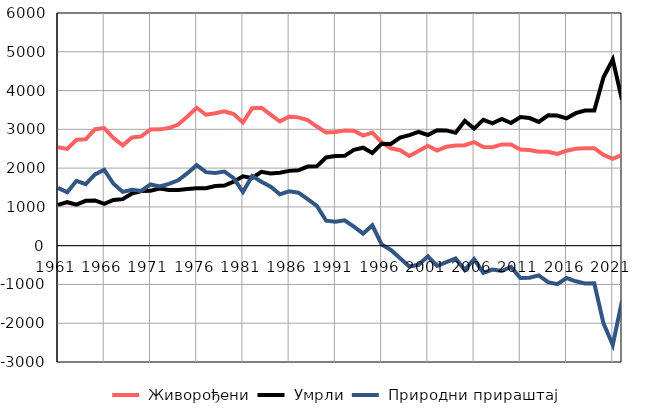
| Category |  Живорођени |  Умрли |  Природни прираштај |
|---|---|---|---|
| 1961.0 | 2539 | 1050 | 1489 |
| 1962.0 | 2496 | 1121 | 1375 |
| 1963.0 | 2731 | 1059 | 1672 |
| 1964.0 | 2743 | 1157 | 1586 |
| 1965.0 | 3003 | 1167 | 1836 |
| 1966.0 | 3033 | 1076 | 1957 |
| 1967.0 | 2776 | 1180 | 1596 |
| 1968.0 | 2587 | 1200 | 1387 |
| 1969.0 | 2789 | 1346 | 1443 |
| 1970.0 | 2817 | 1407 | 1410 |
| 1971.0 | 2997 | 1418 | 1579 |
| 1972.0 | 2999 | 1474 | 1525 |
| 1973.0 | 3033 | 1438 | 1595 |
| 1974.0 | 3124 | 1438 | 1686 |
| 1975.0 | 3331 | 1462 | 1869 |
| 1976.0 | 3556 | 1479 | 2077 |
| 1977.0 | 3376 | 1480 | 1896 |
| 1978.0 | 3415 | 1538 | 1877 |
| 1979.0 | 3463 | 1550 | 1913 |
| 1980.0 | 3392 | 1650 | 1742 |
| 1981.0 | 3175 | 1788 | 1387 |
| 1982.0 | 3543 | 1745 | 1798 |
| 1983.0 | 3557 | 1906 | 1651 |
| 1984.0 | 3382 | 1861 | 1521 |
| 1985.0 | 3202 | 1879 | 1323 |
| 1986.0 | 3332 | 1929 | 1403 |
| 1987.0 | 3309 | 1943 | 1366 |
| 1988.0 | 3238 | 2039 | 1199 |
| 1989.0 | 3072 | 2047 | 1025 |
| 1990.0 | 2920 | 2276 | 644 |
| 1991.0 | 2929 | 2311 | 618 |
| 1992.0 | 2971 | 2317 | 654 |
| 1993.0 | 2963 | 2473 | 490 |
| 1994.0 | 2839 | 2527 | 312 |
| 1995.0 | 2916 | 2390 | 526 |
| 1996.0 | 2663 | 2630 | 33 |
| 1997.0 | 2512 | 2623 | -111 |
| 1998.0 | 2462 | 2788 | -326 |
| 1999.0 | 2313 | 2851 | -538 |
| 2000.0 | 2443 | 2936 | -493 |
| 2001.0 | 2579 | 2854 | -275 |
| 2002.0 | 2453 | 2977 | -524 |
| 2003.0 | 2550 | 2973 | -423 |
| 2004.0 | 2582 | 2910 | -328 |
| 2005.0 | 2591 | 3221 | -630 |
| 2006.0 | 2672 | 3018 | -346 |
| 2007.0 | 2544 | 3244 | -700 |
| 2008.0 | 2539 | 3156 | -617 |
| 2009.0 | 2612 | 3266 | -654 |
| 2010.0 | 2611 | 3162 | -551 |
| 2011.0 | 2482 | 3316 | -834 |
| 2012.0 | 2465 | 3291 | -826 |
| 2013.0 | 2423 | 3190 | -767 |
| 2014.0 | 2420 | 3362 | -942 |
| 2015.0 | 2364 | 3355 | -991 |
| 2016.0 | 2448 | 3284 | -836 |
| 2017.0 | 2498 | 3417 | -919 |
| 2018.0 | 2510 | 3484 | -974 |
| 2019.0 | 2514 | 3485 | -971 |
| 2020.0 | 2341 | 4344 | -2003 |
| 2021.0 | 2241 | 4801 | -2560 |
| 2022.0 | 2340 | 3763 | -1423 |